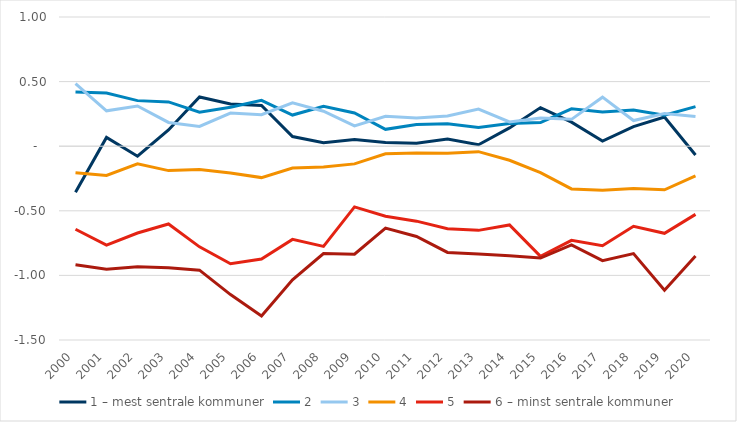
| Category | 1 – mest sentrale kommuner | 2 | 3 | 4 | 5 | 6 – minst sentrale kommuner |
|---|---|---|---|---|---|---|
| 2000.0 | -0.356 | 0.42 | 0.484 | -0.205 | -0.643 | -0.918 |
| 2001.0 | 0.068 | 0.411 | 0.274 | -0.226 | -0.766 | -0.953 |
| 2002.0 | -0.077 | 0.353 | 0.312 | -0.136 | -0.672 | -0.934 |
| 2003.0 | 0.126 | 0.343 | 0.184 | -0.189 | -0.602 | -0.941 |
| 2004.0 | 0.381 | 0.263 | 0.153 | -0.18 | -0.779 | -0.96 |
| 2005.0 | 0.327 | 0.302 | 0.256 | -0.207 | -0.91 | -1.148 |
| 2006.0 | 0.315 | 0.354 | 0.244 | -0.243 | -0.873 | -1.313 |
| 2007.0 | 0.075 | 0.241 | 0.336 | -0.168 | -0.721 | -1.034 |
| 2008.0 | 0.027 | 0.309 | 0.271 | -0.161 | -0.775 | -0.831 |
| 2009.0 | 0.052 | 0.257 | 0.158 | -0.137 | -0.47 | -0.836 |
| 2010.0 | 0.029 | 0.13 | 0.231 | -0.059 | -0.542 | -0.634 |
| 2011.0 | 0.023 | 0.167 | 0.219 | -0.053 | -0.58 | -0.699 |
| 2012.0 | 0.055 | 0.173 | 0.233 | -0.055 | -0.639 | -0.822 |
| 2013.0 | 0.011 | 0.144 | 0.288 | -0.042 | -0.651 | -0.835 |
| 2014.0 | 0.142 | 0.175 | 0.188 | -0.109 | -0.609 | -0.847 |
| 2015.0 | 0.299 | 0.183 | 0.219 | -0.204 | -0.853 | -0.866 |
| 2016.0 | 0.186 | 0.29 | 0.208 | -0.331 | -0.728 | -0.763 |
| 2017.0 | 0.04 | 0.265 | 0.38 | -0.341 | -0.77 | -0.885 |
| 2018.0 | 0.152 | 0.28 | 0.199 | -0.328 | -0.62 | -0.831 |
| 2019.0 | 0.225 | 0.239 | 0.253 | -0.337 | -0.674 | -1.115 |
| 2020.0 | -0.068 | 0.307 | 0.229 | -0.229 | -0.527 | -0.85 |